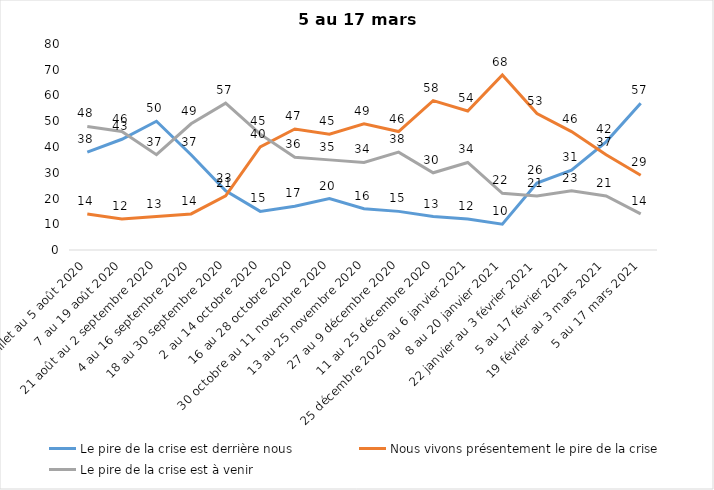
| Category | Le pire de la crise est derrière nous | Nous vivons présentement le pire de la crise | Le pire de la crise est à venir |
|---|---|---|---|
| 24 juillet au 5 août 2020 | 38 | 14 | 48 |
| 7 au 19 août 2020 | 43 | 12 | 46 |
| 21 août au 2 septembre 2020 | 50 | 13 | 37 |
| 4 au 16 septembre 2020 | 37 | 14 | 49 |
| 18 au 30 septembre 2020 | 23 | 21 | 57 |
| 2 au 14 octobre 2020 | 15 | 40 | 45 |
| 16 au 28 octobre 2020 | 17 | 47 | 36 |
| 30 octobre au 11 novembre 2020 | 20 | 45 | 35 |
| 13 au 25 novembre 2020 | 16 | 49 | 34 |
| 27 au 9 décembre 2020 | 15 | 46 | 38 |
| 11 au 25 décembre 2020 | 13 | 58 | 30 |
| 25 décembre 2020 au 6 janvier 2021 | 12 | 54 | 34 |
| 8 au 20 janvier 2021 | 10 | 68 | 22 |
| 22 janvier au 3 février 2021 | 26 | 53 | 21 |
| 5 au 17 février 2021 | 31 | 46 | 23 |
| 19 février au 3 mars 2021 | 42 | 37 | 21 |
| 5 au 17 mars 2021 | 57 | 29 | 14 |